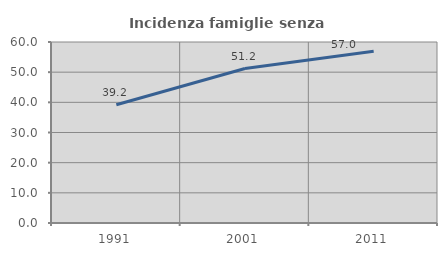
| Category | Incidenza famiglie senza nuclei |
|---|---|
| 1991.0 | 39.189 |
| 2001.0 | 51.205 |
| 2011.0 | 56.97 |